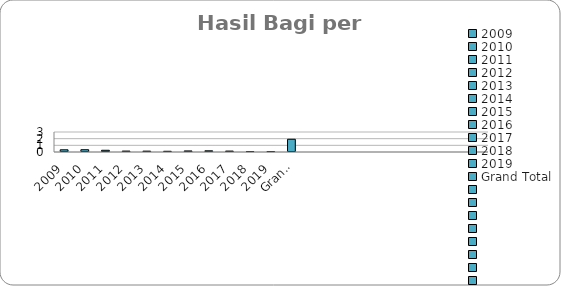
| Category | Total |
|---|---|
| 2009 | 0.33 |
| 2010 | 0.34 |
| 2011 | 0.26 |
| 2012 | 0.14 |
| 2013 | 0.13 |
| 2014 | 0.11 |
| 2015 | 0.16 |
| 2016 | 0.18 |
| 2017 | 0.14 |
| 2018 | 0.06 |
| 2019 | 0.06 |
| Grand Total | 1.91 |